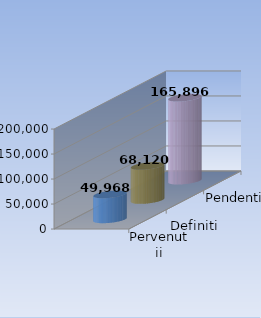
| Category | Pervenutii | Definiti | Pendenti |
|---|---|---|---|
| 0 | 49968 | 68120 | 165896 |